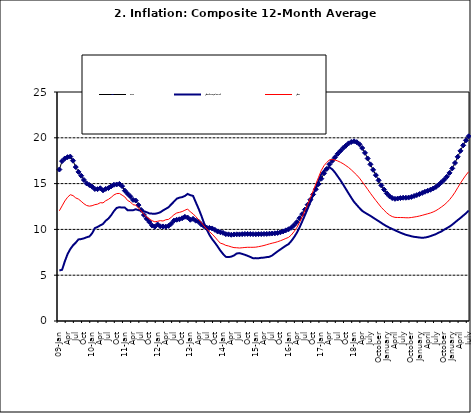
| Category | Food | All Items less Farm Produce | All Items |
|---|---|---|---|
| 09-Jan | 16.536 | 5.519 | 12.032 |
| Feb | 17.454 | 5.591 | 12.567 |
| Mar | 17.742 | 6.51 | 13.101 |
| Apr | 17.89 | 7.302 | 13.51 |
| May | 17.949 | 7.847 | 13.787 |
| June | 17.498 | 8.259 | 13.694 |
| Jul | 16.808 | 8.554 | 13.437 |
| Aug | 16.278 | 8.906 | 13.307 |
| Sep | 15.859 | 8.942 | 13.065 |
| Oct | 15.396 | 9.024 | 12.803 |
| Nov | 15.018 | 9.143 | 12.609 |
| Dec | 14.841 | 9.226 | 12.538 |
| 10-Jan | 14.668 | 9.567 | 12.586 |
| Feb | 14.411 | 10.138 | 12.7 |
| Mar | 14.395 | 10.269 | 12.757 |
| Apr | 14.489 | 10.444 | 12.915 |
| May | 14.266 | 10.597 | 12.893 |
| Jun | 14.424 | 10.948 | 13.132 |
| Jul | 14.514 | 11.193 | 13.284 |
| Aug | 14.706 | 11.549 | 13.5 |
| Sep | 14.872 | 11.997 | 13.764 |
| Oct | 14.906 | 12.345 | 13.908 |
| Nov | 14.967 | 12.423 | 13.928 |
| Dec | 14.723 | 12.383 | 13.74 |
| 11-Jan | 14.233 | 12.385 | 13.542 |
| Feb | 13.903 | 12.099 | 13.161 |
| Mar | 13.606 | 12.077 | 13.001 |
| Apr | 13.227 | 12.088 | 12.694 |
| May | 13.152 | 12.198 | 12.648 |
| Jun | 12.654 | 12.1 | 12.321 |
| Jul | 12.118 | 12.109 | 12.009 |
| Aug | 11.575 | 11.98 | 11.635 |
| Sep | 11.155 | 11.877 | 11.363 |
| Oct | 10.797 | 11.746 | 11.13 |
| Nov | 10.422 | 11.721 | 10.952 |
| Dec | 10.298 | 11.706 | 10.826 |
| 12-Jan | 10.538 | 11.765 | 10.886 |
| 12-Feb | 10.336 | 11.872 | 10.955 |
| 12-Mar | 10.325 | 12.075 | 10.914 |
| Apr | 10.304 | 12.242 | 11.054 |
| May | 10.387 | 12.419 | 11.096 |
| Jun | 10.617 | 12.732 | 11.32 |
| Jul | 10.963 | 13.032 | 11.599 |
| Aug | 11.056 | 13.349 | 11.791 |
| Sep | 11.104 | 13.467 | 11.859 |
| Oct | 11.216 | 13.525 | 11.948 |
| Nov | 11.372 | 13.649 | 12.091 |
| Dec | 11.296 | 13.873 | 12.224 |
| 13-Jan | 11.055 | 13.737 | 11.908 |
| Feb | 11.153 | 13.657 | 11.703 |
| Mar | 10.951 | 12.963 | 11.394 |
| Apr | 10.844 | 12.281 | 11.072 |
| May | 10.548 | 11.531 | 10.761 |
| Jun | 10.352 | 10.704 | 10.383 |
| Jul | 10.186 | 10.005 | 10.047 |
| Aug | 10.168 | 9.4 | 9.761 |
| Sep | 10.105 | 8.939 | 9.486 |
| Oct | 9.955 | 8.553 | 9.167 |
| Nov | 9.774 | 8.136 | 8.815 |
| Dec | 9.695 | 7.691 | 8.496 |
| 14-Jan | 9.626 | 7.317 | 8.408 |
| Feb | 9.484 | 7.005 | 8.257 |
| Mar | 9.464 | 6.976 | 8.19 |
| Apr | 9.416 | 7.03 | 8.092 |
| May | 9.448 | 7.151 | 8.012 |
| Jun | 9.464 | 7.369 | 7.998 |
| Jul | 9.459 | 7.411 | 7.968 |
| Aug | 9.481 | 7.325 | 7.996 |
| Sep | 9.501 | 7.228 | 8.027 |
| Oct | 9.508 | 7.116 | 8.047 |
| Nov | 9.492 | 6.991 | 8.046 |
| Dec | 9.481 | 6.854 | 8.047 |
| 15-Jan | 9.475 | 6.865 | 8.063 |
| Feb | 9.486 | 6.852 | 8.117 |
| Mar | 9.495 | 6.905 | 8.176 |
| Apr | 9.501 | 6.922 | 8.243 |
| May | 9.51 | 6.975 | 8.331 |
| Jun | 9.535 | 7.006 | 8.417 |
| Jul | 9.552 | 7.154 | 8.497 |
| Aug | 9.571 | 7.384 | 8.566 |
| Sep | 9.614 | 7.605 | 8.658 |
| Oct | 9.68 | 7.812 | 8.76 |
| Nov | 9.778 | 8.016 | 8.879 |
| Dec | 9.898 | 8.222 | 9.009 |
| 16-Jan | 10.017 | 8.391 | 9.13 |
| Feb | 10.184 | 8.732 | 9.386 |
| Mar | 10.471 | 9.132 | 9.751 |
| Apr | 10.786 | 9.614 | 10.182 |
| May | 11.221 | 10.196 | 10.746 |
| Jun | 11.672 | 10.864 | 11.372 |
| Jul | 12.162 | 11.553 | 12.045 |
| Aug | 12.696 | 12.247 | 12.744 |
| Sep | 13.238 | 12.98 | 13.454 |
| Oct | 13.817 | 13.757 | 14.206 |
| Nov | 14.386 | 14.542 | 14.958 |
| Dec | 14.946 | 15.307 | 15.697 |
| 17-Jan | 15.536 | 16.042 | 16.441 |
| Feb | 16.127 | 16.436 | 16.958 |
| Mar | 16.598 | 16.682 | 17.315 |
| Apr | 17.106 | 16.772 | 17.591 |
| May | 17.477 | 16.567 | 17.628 |
| Jun | 17.868 | 16.219 | 17.578 |
| Jul | 18.247 | 15.798 | 17.475 |
| Aug | 18.569 | 15.372 | 17.331 |
| Sep | 18.876 | 14.903 | 17.17 |
| Oct | 19.14 | 14.415 | 16.968 |
| Nov | 19.392 | 13.93 | 16.76 |
| Dec | 19.546 | 13.458 | 16.502 |
| 18-Jan | 19.621 | 13.01 | 16.215 |
| Feb | 19.521 | 12.668 | 15.93 |
| Mar | 19.294 | 12.33 | 15.599 |
| Apr | 18.886 | 12.021 | 15.196 |
| May | 18.359 | 11.828 | 14.793 |
| June | 17.745 | 11.651 | 14.371 |
| July | 17.102 | 11.478 | 13.95 |
| August | 16.501 | 11.285 | 13.546 |
| September | 15.923 | 11.092 | 13.157 |
| October | 15.355 | 10.903 | 12.777 |
| November | 14.802 | 10.703 | 12.406 |
| December | 14.348 | 10.514 | 12.095 |
| January | 13.934 | 10.339 | 11.801 |
| February | 13.62 | 10.185 | 11.564 |
| March | 13.42 | 10.044 | 11.401 |
| April | 13.339 | 9.909 | 11.314 |
| May | 13.371 | 9.77 | 11.299 |
| June | 13.418 | 9.64 | 11.297 |
| July | 13.46 | 9.524 | 11.291 |
| August | 13.458 | 9.411 | 11.271 |
| September | 13.474 | 9.337 | 11.268 |
| October | 13.544 | 9.253 | 11.298 |
| November | 13.646 | 9.189 | 11.348 |
| December | 13.743 | 9.155 | 11.396 |
| January | 13.859 | 9.112 | 11.462 |
| February | 13.98 | 9.086 | 11.539 |
| March | 14.109 | 9.112 | 11.624 |
| April | 14.221 | 9.174 | 11.706 |
| May | 14.325 | 9.267 | 11.791 |
| June | 14.46 | 9.375 | 11.904 |
| July | 14.634 | 9.484 | 12.049 |
| August | 14.869 | 9.638 | 12.233 |
| September | 15.135 | 9.775 | 12.44 |
| October | 15.416 | 9.965 | 12.664 |
| November | 15.746 | 10.136 | 12.923 |
| December | 16.169 | 10.308 | 13.246 |
| January | 16.662 | 10.519 | 13.616 |
| February | 17.251 | 10.767 | 14.053 |
| March | 17.929 | 11.015 | 14.554 |
| April | 18.576 | 11.247 | 15.039 |
| May | 19.176 | 11.502 | 15.499 |
| June | 19.721 | 11.75 | 15.927 |
| July | 20.165 | 12.052 | 16.298 |